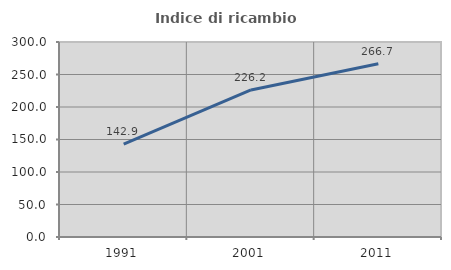
| Category | Indice di ricambio occupazionale  |
|---|---|
| 1991.0 | 142.857 |
| 2001.0 | 226.19 |
| 2011.0 | 266.667 |